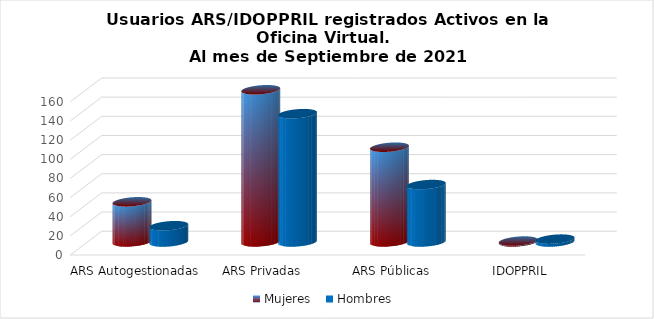
| Category | Mujeres | Hombres |
|---|---|---|
| ARS Autogestionadas | 42 | 17 |
| ARS Privadas | 159 | 134 |
| ARS Públicas | 99 | 60 |
| IDOPPRIL | 1 | 3 |